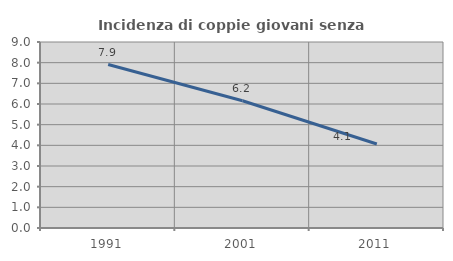
| Category | Incidenza di coppie giovani senza figli |
|---|---|
| 1991.0 | 7.91 |
| 2001.0 | 6.159 |
| 2011.0 | 4.065 |